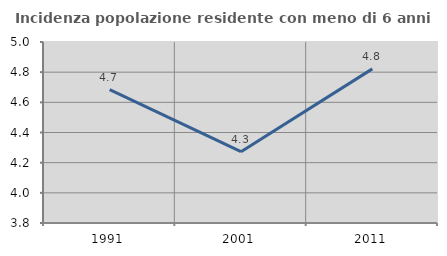
| Category | Incidenza popolazione residente con meno di 6 anni |
|---|---|
| 1991.0 | 4.684 |
| 2001.0 | 4.273 |
| 2011.0 | 4.822 |